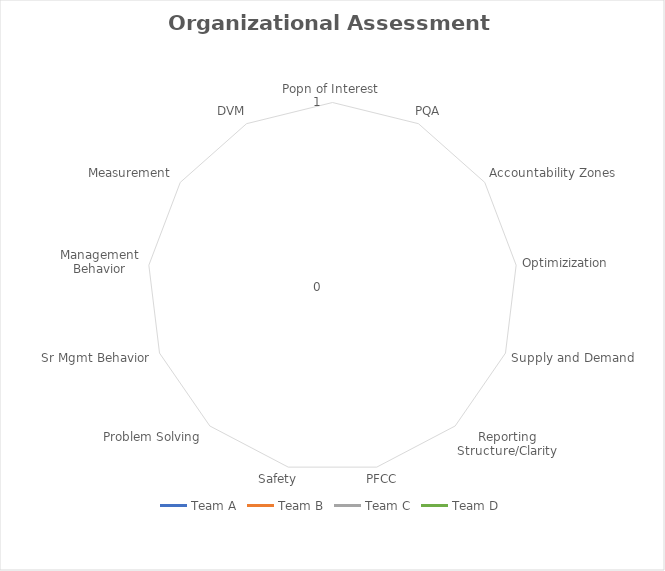
| Category | Team A | Team B | Team C | Team D |
|---|---|---|---|---|
| Popn of Interest | 0 | 0 | 0 | 0 |
| PQA | 0 | 0 | 0 | 0 |
| Accountability Zones | 0 | 0 | 0 | 0 |
| Optimizization  | 0 | 0 | 0 | 0 |
| Supply and Demand | 0 | 0 | 0 | 0 |
| Reporting Structure/Clarity | 0 | 0 | 0 | 0 |
| PFCC | 0 | 0 | 0 | 0 |
| Safety | 0 | 0 | 0 | 0 |
| Problem Solving  | 0 | 0 | 0 | 0 |
| Sr Mgmt Behavior | 0 | 0 | 0 | 0 |
| Management Behavior | 0 | 0 | 0 | 0 |
| Measurement | 0 | 0 | 0 | 0 |
| DVM | 0 | 0 | 0 | 0 |